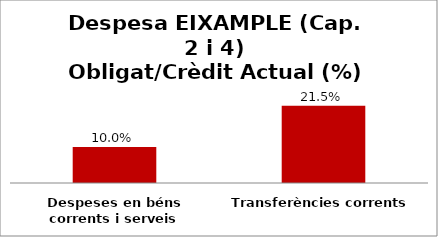
| Category | Series 0 |
|---|---|
| Despeses en béns corrents i serveis | 0.1 |
| Transferències corrents | 0.215 |